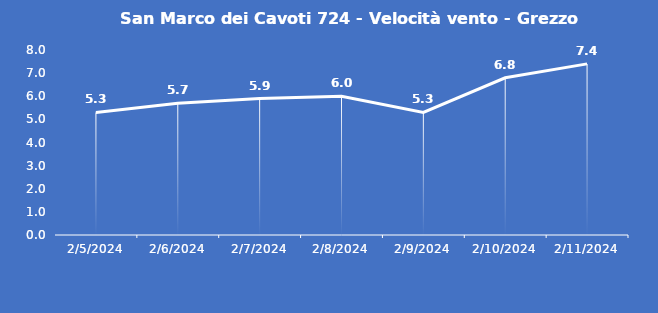
| Category | San Marco dei Cavoti 724 - Velocità vento - Grezzo (m/s) |
|---|---|
| 2/5/24 | 5.3 |
| 2/6/24 | 5.7 |
| 2/7/24 | 5.9 |
| 2/8/24 | 6 |
| 2/9/24 | 5.3 |
| 2/10/24 | 6.8 |
| 2/11/24 | 7.4 |